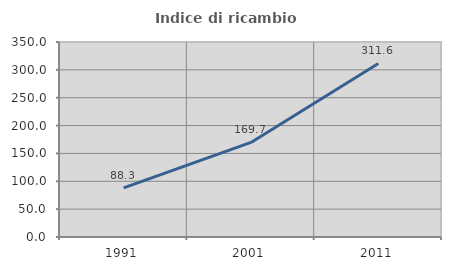
| Category | Indice di ricambio occupazionale  |
|---|---|
| 1991.0 | 88.321 |
| 2001.0 | 169.705 |
| 2011.0 | 311.579 |